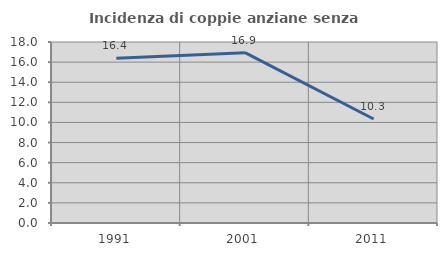
| Category | Incidenza di coppie anziane senza figli  |
|---|---|
| 1991.0 | 16.387 |
| 2001.0 | 16.938 |
| 2011.0 | 10.345 |